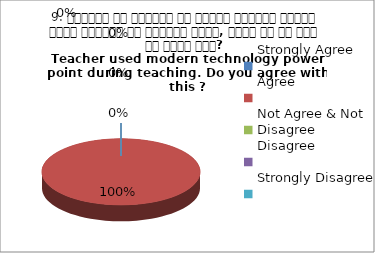
| Category | 9. शिक्षक ने शिक्षण के दौरान आधुनिक तकनीक पावर पॉइन्ट का प्रयोग किया, क्या आप इस बात से सहमत हैं? 
Teacher used modern technology power point during teaching. Do you agree with this ?
 Agree Agree Agree Agree Agree |
|---|---|
| Strongly Agree | 0 |
| Agree | 4 |
| Not Agree & Not Disagree | 0 |
| Disagree | 0 |
| Strongly Disagree | 0 |